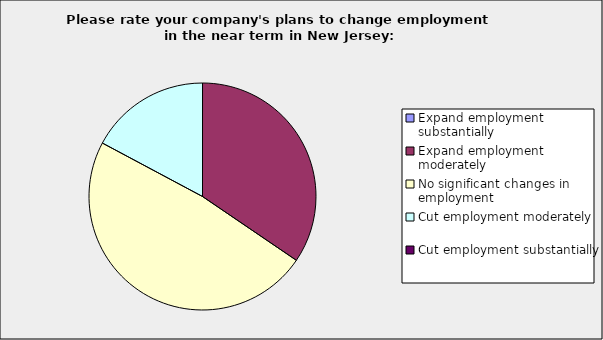
| Category | Series 0 |
|---|---|
| Expand employment substantially | 0 |
| Expand employment moderately | 0.345 |
| No significant changes in employment | 0.483 |
| Cut employment moderately | 0.172 |
| Cut employment substantially | 0 |